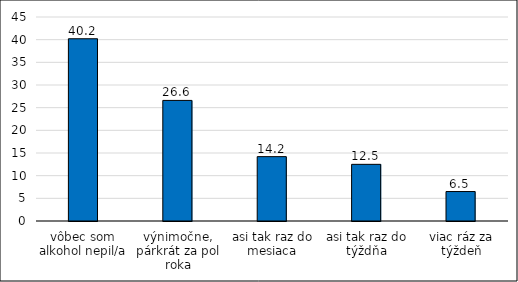
| Category | Rad 1 |
|---|---|
| vôbec som alkohol nepil/a | 40.2 |
| výnimočne, párkrát za pol roka | 26.6 |
| asi tak raz do mesiaca | 14.2 |
| asi tak raz do týždňa | 12.5 |
| viac ráz za týždeň | 6.5 |